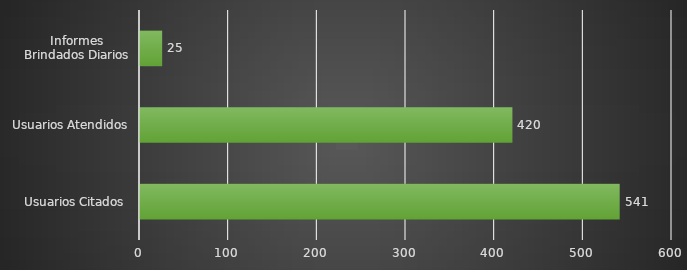
| Category | INDICADOR  |
|---|---|
| Usuarios Citados  | 541 |
| Usuarios Atendidos | 420 |
| Informes Brindados Diarios | 25 |